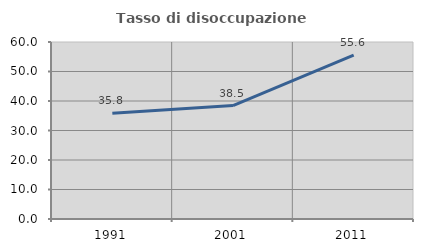
| Category | Tasso di disoccupazione giovanile  |
|---|---|
| 1991.0 | 35.849 |
| 2001.0 | 38.462 |
| 2011.0 | 55.556 |